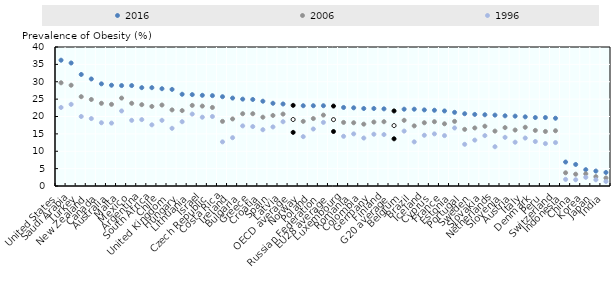
| Category | 2016 | 2006 | 1996 |
|---|---|---|---|
| United States | 36.2 | 29.7 | 22.6 |
| Saudi Arabia | 35.4 | 29 | 23.5 |
| Turkey | 32.1 | 25.7 | 20 |
| New Zealand | 30.8 | 24.9 | 19.4 |
| Canada | 29.4 | 23.8 | 18.2 |
| Australia | 29 | 23.5 | 18.1 |
| Malta | 28.9 | 25.3 | 21.6 |
| Mexico | 28.9 | 23.8 | 18.9 |
| Argentina | 28.3 | 23.4 | 19.1 |
| South Africa | 28.3 | 22.9 | 17.6 |
| Chile | 28 | 23.3 | 18.9 |
| United Kingdom | 27.8 | 21.9 | 16.6 |
| Hungary | 26.4 | 21.7 | 18.5 |
| Lithuania | 26.3 | 23.2 | 20.7 |
| Israel | 26.1 | 23 | 19.8 |
| Czech Republic | 26 | 22.6 | 20 |
| Costa Rica | 25.7 | 18.6 | 12.7 |
| Ireland | 25.3 | 19.3 | 13.9 |
| Bulgaria | 25 | 20.8 | 17.3 |
| Greece | 24.9 | 20.8 | 17.1 |
| Croatia | 24.4 | 19.8 | 16.2 |
| Spain | 23.8 | 20.3 | 17 |
| Latvia | 23.6 | 20.7 | 18.5 |
| OECD average | 23.206 | 19.136 | 15.428 |
| Norway | 23.1 | 18.6 | 14.2 |
| Poland | 23.1 | 19.4 | 16.4 |
| Russian Federation | 23.1 | 20.4 | 18.3 |
| EU28 average | 23 | 19.104 | 15.679 |
| Luxembourg | 22.6 | 18.3 | 14.3 |
| Romania | 22.5 | 18.2 | 15 |
| Colombia | 22.3 | 17.8 | 13.8 |
| Germany | 22.3 | 18.4 | 14.9 |
| Finland | 22.2 | 18.5 | 14.8 |
| G20 average | 21.6 | 17.384 | 13.584 |
| Belgium | 22.1 | 18.9 | 15.8 |
| Brazil | 22.1 | 17.3 | 12.7 |
| Iceland | 21.9 | 18.2 | 14.6 |
| Cyprus | 21.8 | 18.5 | 15 |
| France | 21.6 | 17.9 | 14.5 |
| Estonia | 21.2 | 18.6 | 16.7 |
| Portugal | 20.8 | 16.3 | 12 |
| Sweden | 20.6 | 16.7 | 13.2 |
| Slovakia | 20.5 | 17.2 | 14.5 |
| Netherlands | 20.4 | 15.8 | 11.3 |
| Slovenia | 20.2 | 16.8 | 14 |
| Austria | 20.1 | 16.1 | 12.6 |
| Italy | 19.9 | 16.9 | 13.8 |
| Denmark | 19.7 | 16 | 12.8 |
| Peru | 19.7 | 15.7 | 12.2 |
| Switzerland | 19.5 | 15.9 | 12.5 |
| Indonesia | 6.9 | 3.8 | 1.9 |
| China | 6.2 | 3.4 | 1.8 |
| Korea | 4.7 | 3.5 | 2.5 |
| Japan | 4.3 | 2.7 | 1.8 |
| India | 3.9 | 2.3 | 1.3 |